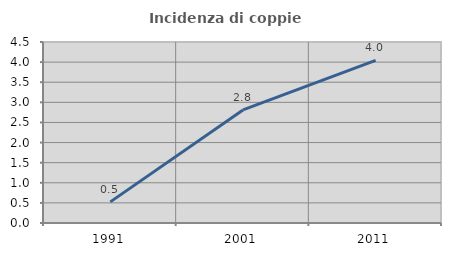
| Category | Incidenza di coppie miste |
|---|---|
| 1991.0 | 0.525 |
| 2001.0 | 2.811 |
| 2011.0 | 4.044 |